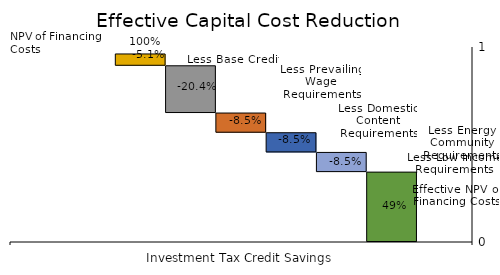
| Category | Effective NPV of Financing Costs | Less Low Income Requirements | Less Energy Community Requirements | Less Domestic Content Requirements | Less Prevailing Wage Requirements | Less Base Credit | NPV of Financing Costs |
|---|---|---|---|---|---|---|---|
| 0 | 358388.824 | 100980.34 | 100980.34 | 100980.34 | 242352.815 | 60588.204 | 0 |